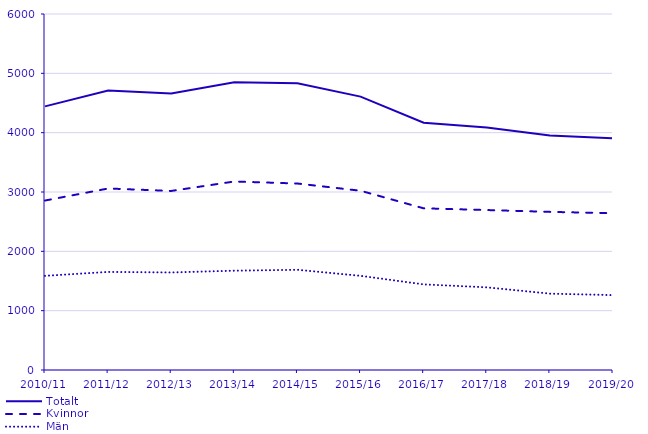
| Category | Totalt | Kvinnor | Män |
|---|---|---|---|
| 2010/11 | 4443 | 2856 | 1587 |
| 2011/12 | 4712 | 3059 | 1653 |
| 2012/13 | 4662 | 3018 | 1644 |
| 2013/14 | 4851 | 3177 | 1674 |
| 2014/15 | 4832 | 3143 | 1689 |
| 2015/16 | 4608 | 3021 | 1587 |
| 2016/17 | 4168 | 2725 | 1443 |
| 2017/18 | 4089 | 2696 | 1393 |
| 2018/19 | 3952 | 2665 | 1287 |
| 2019/20 | 3905 | 2643 | 1262 |